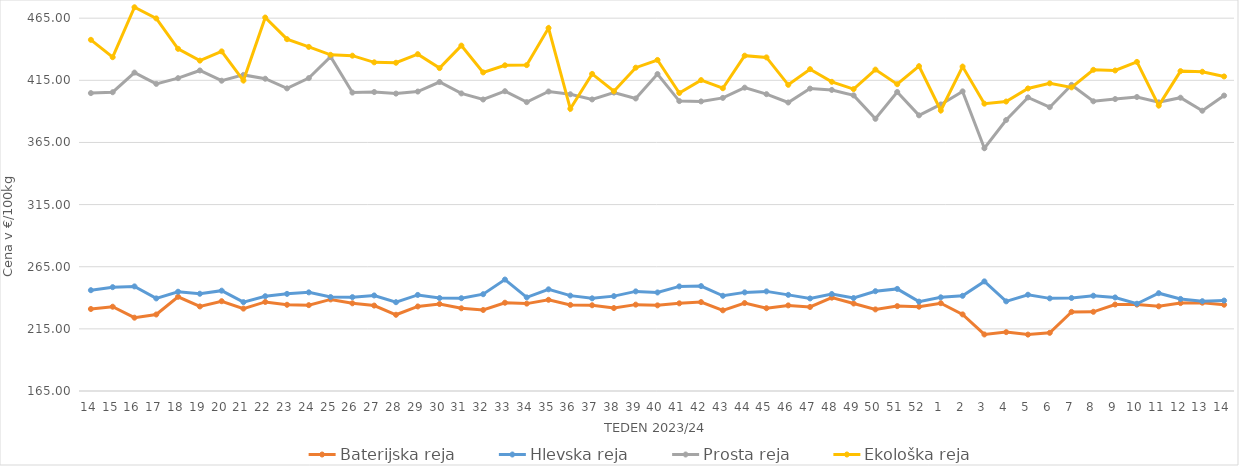
| Category | Baterijska reja | Hlevska reja | Prosta reja | Ekološka reja |
|---|---|---|---|---|
| 14.0 | 230.99 | 246.12 | 404.72 | 447.59 |
| 15.0 | 232.82 | 248.56 | 405.42 | 433.62 |
| 16.0 | 224 | 249.17 | 421.22 | 473.79 |
| 17.0 | 226.57 | 239.5 | 412.13 | 464.83 |
| 18.0 | 240.83 | 244.89 | 416.74 | 440.35 |
| 19.0 | 233.05 | 243.26 | 422.93 | 430.86 |
| 20.0 | 237.25 | 245.73 | 414.68 | 438.28 |
| 21.0 | 231.3 | 236.5 | 419.36 | 414.83 |
| 22.0 | 236.67 | 241.27 | 416.27 | 465.52 |
| 23.0 | 234.39 | 243.16 | 408.53 | 448.1 |
| 24.0 | 234.08 | 244.37 | 416.78 | 441.9 |
| 25.0 | 238.69 | 240.6 | 434.05 | 435.52 |
| 26.0 | 235.57 | 240.51 | 405.15 | 434.83 |
| 27.0 | 233.75 | 241.89 | 405.58 | 429.48 |
| 28.0 | 226.35 | 236.46 | 404.32 | 429.14 |
| 29.0 | 233.03 | 242.31 | 405.96 | 436.04 |
| 30.0 | 235 | 239.8 | 413.63 | 424.83 |
| 31.0 | 231.55 | 239.67 | 404.46 | 442.93 |
| 32.0 | 230.2 | 242.89 | 399.57 | 421.38 |
| 33.0 | 236.04 | 254.68 | 406.23 | 427.07 |
| 34.0 | 235.32 | 240.35 | 397.45 | 427.24 |
| 35.0 | 238.39 | 246.82 | 406 | 457.07 |
| 36.0 | 234.27 | 241.75 | 403.79 | 392.07 |
| 37.0 | 234 | 239.58 | 399.61 | 420.17 |
| 38.0 | 231.74 | 241.34 | 405.14 | 406.21 |
| 39.0 | 234.5 | 245.15 | 400.39 | 425.17 |
| 40.0 | 233.92 | 244.29 | 420.04 | 431.38 |
| 41.0 | 235.54 | 249.18 | 398.28 | 404.83 |
| 42.0 | 236.54 | 249.42 | 398.03 | 415.17 |
| 43.0 | 229.92 | 241.62 | 400.86 | 408.62 |
| 44.0 | 235.77 | 244.36 | 409.1 | 434.83 |
| 45.0 | 231.6 | 245.16 | 403.86 | 433.45 |
| 46.0 | 233.89 | 242.36 | 397.17 | 411.38 |
| 47.0 | 232.62 | 239.48 | 408.34 | 423.97 |
| 48.0 | 240.11 | 243.04 | 407.25 | 413.79 |
| 49.0 | 235.41 | 239.81 | 402.87 | 407.93 |
| 50.0 | 230.65 | 245.3 | 384.02 | 423.62 |
| 51.0 | 233.3 | 247.16 | 405.6 | 411.9 |
| 52.0 | 232.85 | 236.91 | 386.82 | 426.38 |
| 1.0 | 235.66 | 240.38 | 395.59 | 390.69 |
| 2.0 | 226.65 | 241.59 | 406.11 | 426.03 |
| 3.0 | 210.5 | 253.21 | 360.35 | 396.21 |
| 4.0 | 212.37 | 237.14 | 383.09 | 397.93 |
| 5.0 | 210.38 | 242.47 | 401.23 | 408.45 |
| 6.0 | 211.82 | 239.54 | 393.39 | 412.59 |
| 7.0 | 228.66 | 239.86 | 411.29 | 409.31 |
| 8.0 | 228.73 | 241.68 | 398.12 | 423.45 |
| 9.0 | 234.57 | 240.29 | 399.93 | 422.93 |
| 10.0 | 234.52 | 235.22 | 401.58 | 429.83 |
| 11.0 | 233.13 | 243.7 | 397.29 | 394.66 |
| 12.0 | 235.73 | 239.09 | 401.01 | 422.41 |
| 13.0 | 236.07 | 237.25 | 390.54 | 421.9 |
| 14.0 | 234.43 | 237.78 | 402.72 | 418.1 |